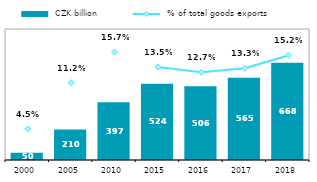
| Category |  CZK billion |
|---|---|
| 2000.0 | 50.471 |
| 2005.0 | 209.533 |
| 2010.0 | 396.508 |
| 2015.0 | 523.827 |
| 2016.0 | 506.018 |
| 2017.0 | 564.57 |
| 2018.0 | 667.928 |